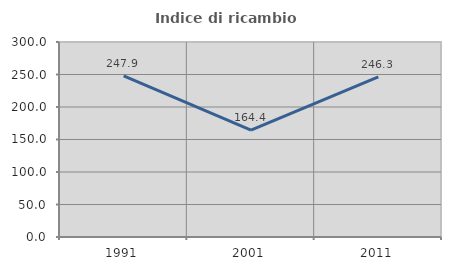
| Category | Indice di ricambio occupazionale  |
|---|---|
| 1991.0 | 247.917 |
| 2001.0 | 164.368 |
| 2011.0 | 246.296 |